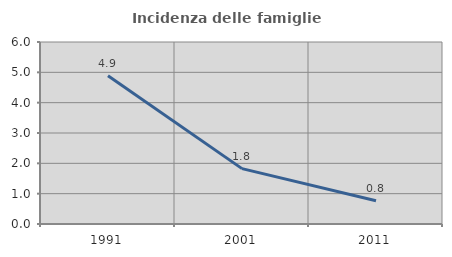
| Category | Incidenza delle famiglie numerose |
|---|---|
| 1991.0 | 4.886 |
| 2001.0 | 1.825 |
| 2011.0 | 0.769 |